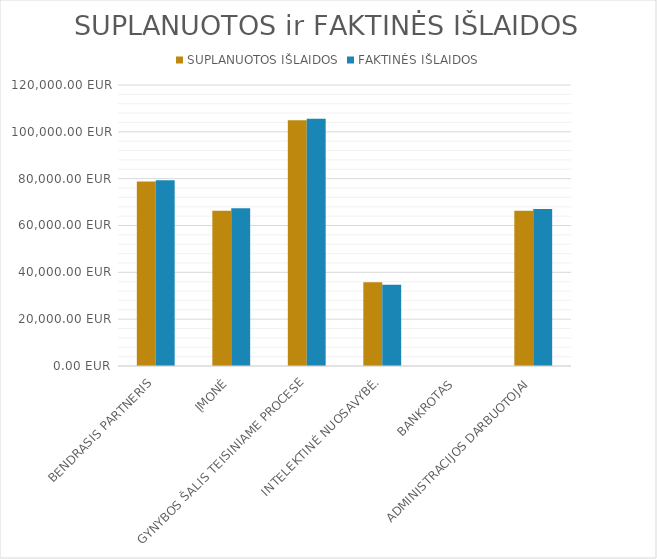
| Category | SUPLANUOTOS IŠLAIDOS | FAKTINĖS IŠLAIDOS |
|---|---|---|
| BENDRASIS PARTNERIS | 78750 | 79275 |
| ĮMONĖ | 66250 | 67375 |
| GYNYBOS ŠALIS TEISINIAME PROCESE | 105000 | 105600 |
| INTELEKTINĖ NUOSAVYBĖ. | 35750 | 34650 |
| BANKROTAS | 0 | 0 |
| ADMINISTRACIJOS DARBUOTOJAI | 66250 | 67000 |